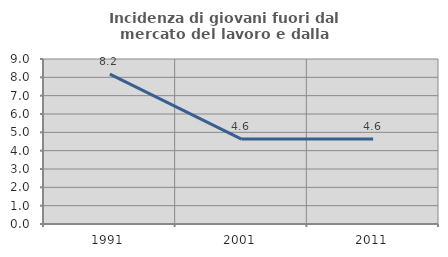
| Category | Incidenza di giovani fuori dal mercato del lavoro e dalla formazione  |
|---|---|
| 1991.0 | 8.176 |
| 2001.0 | 4.633 |
| 2011.0 | 4.641 |